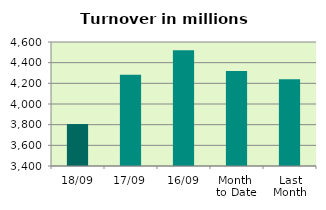
| Category | Series 0 |
|---|---|
| 18/09 | 3805.919 |
| 17/09 | 4283.736 |
| 16/09 | 4519.753 |
| Month 
to Date | 4319.216 |
| Last
Month | 4240.294 |